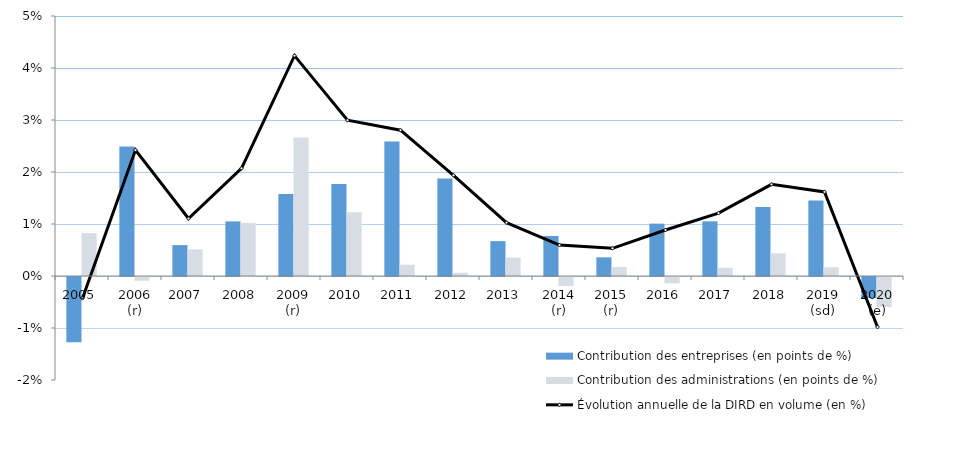
| Category | Contribution des entreprises (en points de %) | Contribution des administrations (en points de %) |
|---|---|---|
| 2005 | -0.013 | 0.008 |
| 2006 (r) | 0.025 | -0.001 |
| 2007 | 0.006 | 0.005 |
| 2008 | 0.011 | 0.01 |
| 2009 (r) | 0.016 | 0.027 |
| 2010 | 0.018 | 0.012 |
| 2011 | 0.026 | 0.002 |
| 2012 | 0.019 | 0.001 |
| 2013 | 0.007 | 0.004 |
| 2014 (r) | 0.008 | -0.002 |
| 2015 (r) | 0.004 | 0.002 |
| 2016 | 0.01 | -0.001 |
| 2017 | 0.011 | 0.002 |
| 2018 | 0.013 | 0.004 |
| 2019 (sd) | 0.014 | 0.002 |
| 2020 (e) | -0.004 | -0.006 |